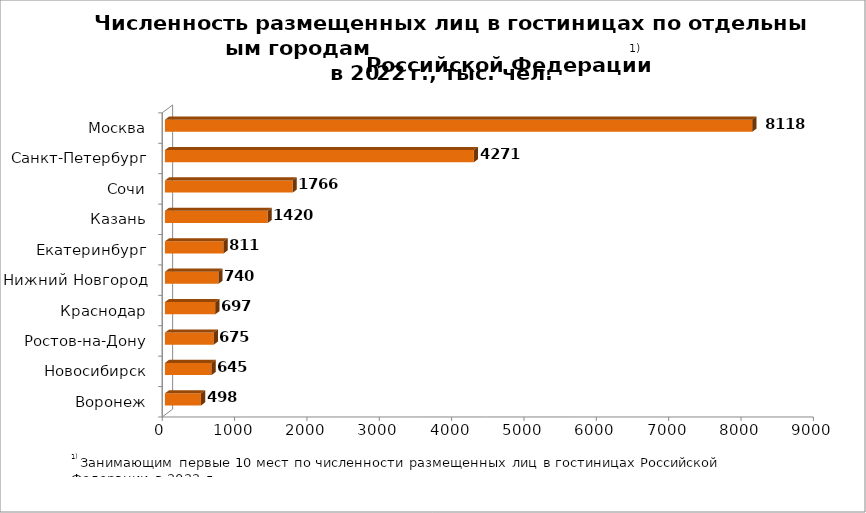
| Category | Series 0 |
|---|---|
| Воронеж | 498.203 |
| Новосибирск | 644.649 |
| Ростов-на-Дону | 675.173 |
| Краснодар | 697.112 |
| Нижний Новгород | 739.907 |
| Екатеринбург | 810.623 |
| Казань | 1420.21 |
| Сочи | 1765.81 |
| Санкт-Петербург | 4270.658 |
| Москва | 8118.401 |